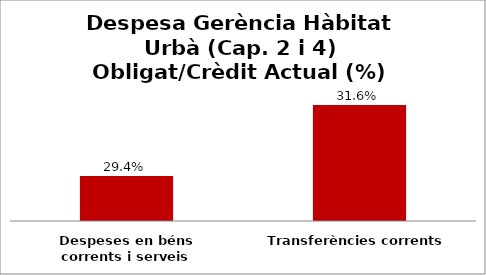
| Category | Series 0 |
|---|---|
| Despeses en béns corrents i serveis | 0.294 |
| Transferències corrents | 0.316 |